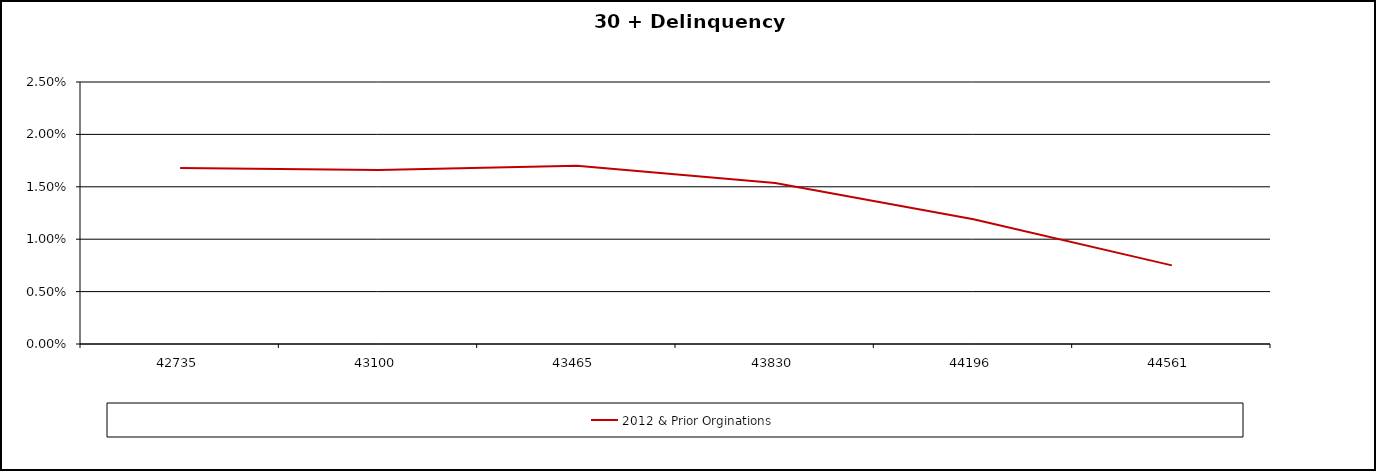
| Category | 2012 & Prior Orginations  |
|---|---|
| 2016-12-31 | 0.017 |
| 2017-12-31 | 0.017 |
| 2018-12-31 | 0.017 |
| 2019-12-31 | 0.015 |
| 2020-12-31 | 0.012 |
| 2021-12-31 | 0.008 |